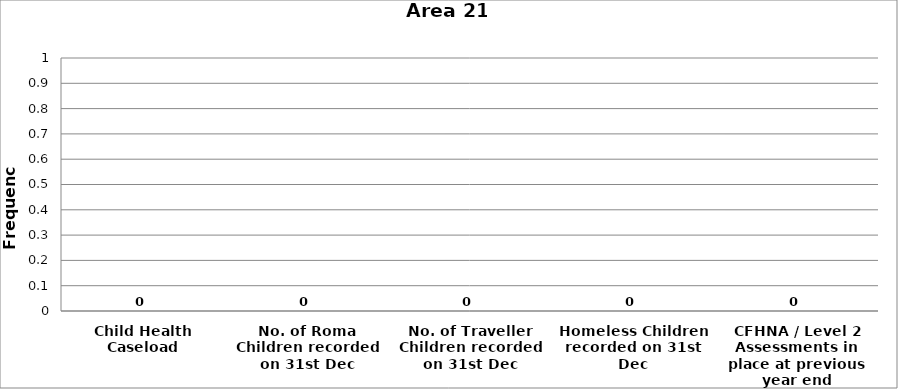
| Category | Area 21 |
|---|---|
| Child Health Caseload | 0 |
| No. of Roma Children recorded on 31st Dec | 0 |
| No. of Traveller Children recorded on 31st Dec | 0 |
| Homeless Children recorded on 31st Dec | 0 |
| CFHNA / Level 2 Assessments in place at previous year end | 0 |